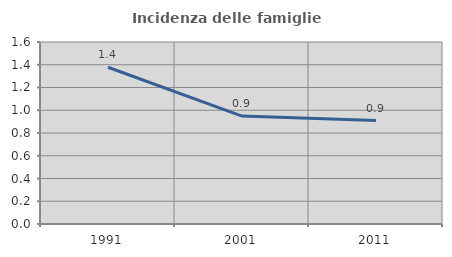
| Category | Incidenza delle famiglie numerose |
|---|---|
| 1991.0 | 1.378 |
| 2001.0 | 0.949 |
| 2011.0 | 0.91 |